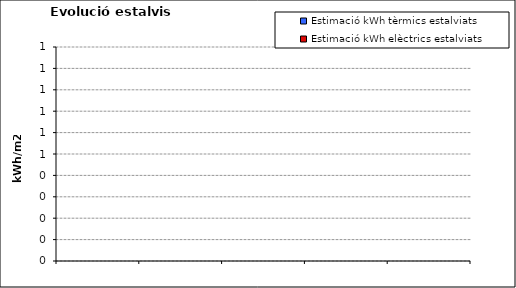
| Category | Estimació kWh elèctrics estalviats | Estimació kWh tèrmics estalviats |
|---|---|---|
| 0 | 0 | 0 |
| 1 | 0 | 0 |
| 2 | 0 | 0 |
| 3 | 0 | 0 |
| 4 | 0 | 0 |